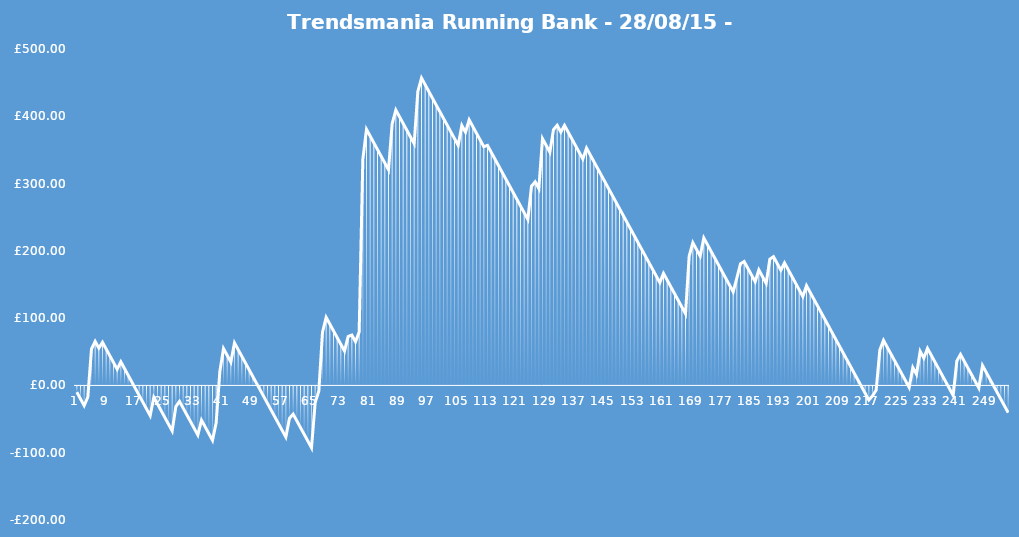
| Category | Running Bank |
|---|---|
| 0 | -10 |
| 1 | -20 |
| 2 | -30 |
| 3 | -17.27 |
| 4 | 54.265 |
| 5 | 65.475 |
| 6 | 55.475 |
| 7 | 64.12 |
| 8 | 54.12 |
| 9 | 44.12 |
| 10 | 34.12 |
| 11 | 24.12 |
| 12 | 35.14 |
| 13 | 25.14 |
| 14 | 15.14 |
| 15 | 5.14 |
| 16 | -4.86 |
| 17 | -14.86 |
| 18 | -24.86 |
| 19 | -34.86 |
| 20 | -44.86 |
| 21 | -17.595 |
| 22 | -27.595 |
| 23 | -37.595 |
| 24 | -47.595 |
| 25 | -57.595 |
| 26 | -67.595 |
| 27 | -31.495 |
| 28 | -23.705 |
| 29 | -33.705 |
| 30 | -43.705 |
| 31 | -53.705 |
| 32 | -63.705 |
| 33 | -73.705 |
| 34 | -51.57 |
| 35 | -61.57 |
| 36 | -71.57 |
| 37 | -81.57 |
| 38 | -55.445 |
| 39 | 20.555 |
| 40 | 54.755 |
| 41 | 44.755 |
| 42 | 34.755 |
| 43 | 63.255 |
| 44 | 53.255 |
| 45 | 43.255 |
| 46 | 33.255 |
| 47 | 23.255 |
| 48 | 13.255 |
| 49 | 3.255 |
| 50 | -6.745 |
| 51 | -16.745 |
| 52 | -26.745 |
| 53 | -36.745 |
| 54 | -46.745 |
| 55 | -56.745 |
| 56 | -66.745 |
| 57 | -76.745 |
| 58 | -48.815 |
| 59 | -42.64 |
| 60 | -52.64 |
| 61 | -62.64 |
| 62 | -72.64 |
| 63 | -82.64 |
| 64 | -92.64 |
| 65 | -25.57 |
| 66 | -8.47 |
| 67 | 79.215 |
| 68 | 101.16 |
| 69 | 91.16 |
| 70 | 81.16 |
| 71 | 71.16 |
| 72 | 61.16 |
| 73 | 51.16 |
| 74 | 72.82 |
| 75 | 74.91 |
| 76 | 64.91 |
| 77 | 79.445 |
| 78 | 335.945 |
| 79 | 380.595 |
| 80 | 370.595 |
| 81 | 360.595 |
| 82 | 350.595 |
| 83 | 340.595 |
| 84 | 330.595 |
| 85 | 320.595 |
| 86 | 388.995 |
| 87 | 409.325 |
| 88 | 399.325 |
| 89 | 389.325 |
| 90 | 379.325 |
| 91 | 369.325 |
| 92 | 359.325 |
| 93 | 436.94 |
| 94 | 456.89 |
| 95 | 446.89 |
| 96 | 436.89 |
| 97 | 426.89 |
| 98 | 416.89 |
| 99 | 406.89 |
| 100 | 396.89 |
| 101 | 386.89 |
| 102 | 376.89 |
| 103 | 366.89 |
| 104 | 356.89 |
| 105 | 386.34 |
| 106 | 376.34 |
| 107 | 394.77 |
| 108 | 384.77 |
| 109 | 374.77 |
| 110 | 364.77 |
| 111 | 354.77 |
| 112 | 356.765 |
| 113 | 346.765 |
| 114 | 336.765 |
| 115 | 326.765 |
| 116 | 316.765 |
| 117 | 306.765 |
| 118 | 296.765 |
| 119 | 286.765 |
| 120 | 276.765 |
| 121 | 266.765 |
| 122 | 256.765 |
| 123 | 246.765 |
| 124 | 296.165 |
| 125 | 302.625 |
| 126 | 292.625 |
| 127 | 366.725 |
| 128 | 356.725 |
| 129 | 346.725 |
| 130 | 380.165 |
| 131 | 386.625 |
| 132 | 376.625 |
| 133 | 386.505 |
| 134 | 376.505 |
| 135 | 366.505 |
| 136 | 356.505 |
| 137 | 346.505 |
| 138 | 336.505 |
| 139 | 352.845 |
| 140 | 342.845 |
| 141 | 332.845 |
| 142 | 322.845 |
| 143 | 312.845 |
| 144 | 302.845 |
| 145 | 292.845 |
| 146 | 282.845 |
| 147 | 272.845 |
| 148 | 262.845 |
| 149 | 252.845 |
| 150 | 242.845 |
| 151 | 232.845 |
| 152 | 222.845 |
| 153 | 212.845 |
| 154 | 202.845 |
| 155 | 192.845 |
| 156 | 182.845 |
| 157 | 172.845 |
| 158 | 162.845 |
| 159 | 152.845 |
| 160 | 166.62 |
| 161 | 156.62 |
| 162 | 146.62 |
| 163 | 136.62 |
| 164 | 126.62 |
| 165 | 116.62 |
| 166 | 106.62 |
| 167 | 192.12 |
| 168 | 212.165 |
| 169 | 202.165 |
| 170 | 192.165 |
| 171 | 219.145 |
| 172 | 209.145 |
| 173 | 199.145 |
| 174 | 189.145 |
| 175 | 179.145 |
| 176 | 169.145 |
| 177 | 159.145 |
| 178 | 149.145 |
| 179 | 139.145 |
| 180 | 159.57 |
| 181 | 180.85 |
| 182 | 184.175 |
| 183 | 174.175 |
| 184 | 164.175 |
| 185 | 154.175 |
| 186 | 171.75 |
| 187 | 161.75 |
| 188 | 151.75 |
| 189 | 187.66 |
| 190 | 191.365 |
| 191 | 181.365 |
| 192 | 171.365 |
| 193 | 182.195 |
| 194 | 172.195 |
| 195 | 162.195 |
| 196 | 152.195 |
| 197 | 142.195 |
| 198 | 132.195 |
| 199 | 148.345 |
| 200 | 138.345 |
| 201 | 128.345 |
| 202 | 118.345 |
| 203 | 108.345 |
| 204 | 98.345 |
| 205 | 88.345 |
| 206 | 78.345 |
| 207 | 68.345 |
| 208 | 58.345 |
| 209 | 48.345 |
| 210 | 38.345 |
| 211 | 28.345 |
| 212 | 18.345 |
| 213 | 8.345 |
| 214 | -1.655 |
| 215 | -11.655 |
| 216 | -21.655 |
| 217 | -15.48 |
| 218 | -7.025 |
| 219 | 52.73 |
| 220 | 67.075 |
| 221 | 57.075 |
| 222 | 47.075 |
| 223 | 37.075 |
| 224 | 27.075 |
| 225 | 17.075 |
| 226 | 7.075 |
| 227 | -2.925 |
| 228 | 26.525 |
| 229 | 16.525 |
| 230 | 50.725 |
| 231 | 40.725 |
| 232 | 55.165 |
| 233 | 45.165 |
| 234 | 35.165 |
| 235 | 25.165 |
| 236 | 15.165 |
| 237 | 5.165 |
| 238 | -4.835 |
| 239 | -14.835 |
| 240 | 36.275 |
| 241 | 46.155 |
| 242 | 36.155 |
| 243 | 26.155 |
| 244 | 16.155 |
| 245 | 6.155 |
| 246 | -3.845 |
| 247 | 29.595 |
| 248 | 19.595 |
| 249 | 9.595 |
| 250 | -0.405 |
| 251 | -10.405 |
| 252 | -20.405 |
| 253 | -30.405 |
| 254 | -40.405 |